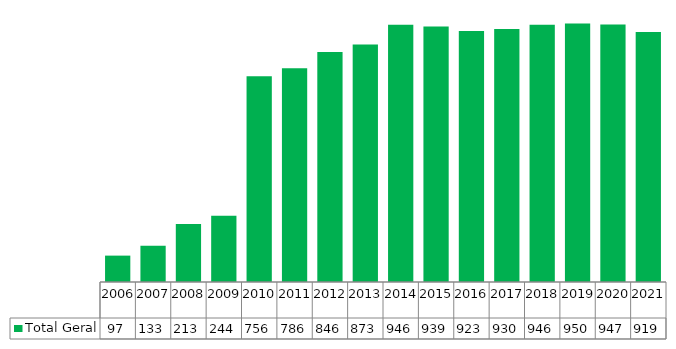
| Category | Total Geral |
|---|---|
| 2006.0 | 97 |
| 2007.0 | 133 |
| 2008.0 | 213 |
| 2009.0 | 244 |
| 2010.0 | 756 |
| 2011.0 | 786 |
| 2012.0 | 846 |
| 2013.0 | 873 |
| 2014.0 | 946 |
| 2015.0 | 939 |
| 2016.0 | 923 |
| 2017.0 | 930 |
| 2018.0 | 946 |
| 2019.0 | 950 |
| 2020.0 | 947 |
| 2021.0 | 919 |